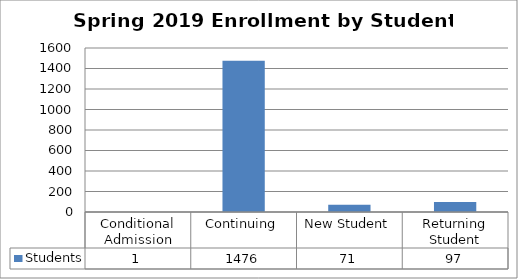
| Category | Students |
|---|---|
| Conditional Admission | 1 |
| Continuing | 1476 |
| New Student | 71 |
| Returning Student | 97 |